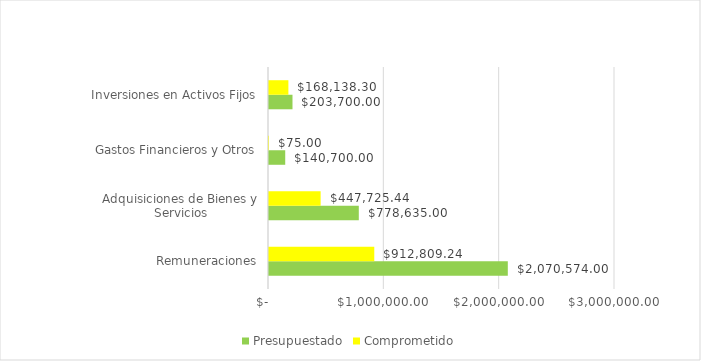
| Category | Presupuestado | Comprometido |
|---|---|---|
| Remuneraciones | 2070574 | 912809.24 |
| Adquisiciones de Bienes y Servicios | 778635 | 447725.44 |
| Gastos Financieros y Otros | 140700 | 75 |
| Inversiones en Activos Fijos | 203700 | 168138.3 |